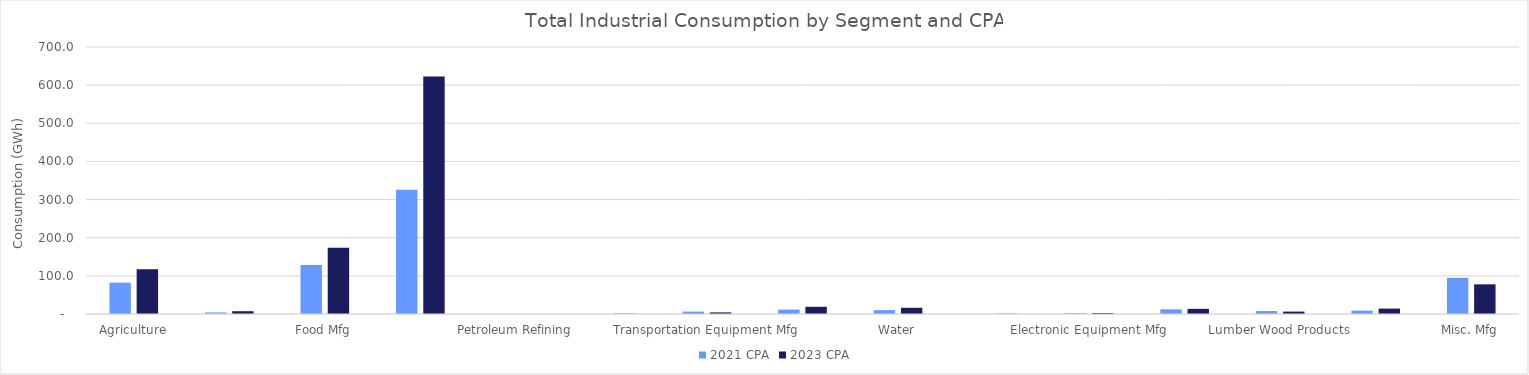
| Category | 2021 CPA | 2023 CPA |
|---|---|---|
| Agriculture | 82.108 | 117.022 |
| Mining | 4.086 | 7.345 |
| Food Mfg | 128.166 | 173.956 |
| Paper Mfg | 326.003 | 622.375 |
| Petroleum Refining | 0.117 | 0.06 |
| Stone Clay Glass Products | 0.441 | 0.792 |
| Transportation Equipment Mfg | 6.323 | 4.202 |
| Wastewater | 11.522 | 18.935 |
| Water | 10.188 | 16.289 |
| Chemical Mfg | 0.419 | 0.55 |
| Electronic Equipment Mfg | 2.138 | 2.636 |
| Industrial Machinery | 12.333 | 13.491 |
| Lumber Wood Products | 7.768 | 6.327 |
| Metal Mfg | 8.812 | 14.176 |
| Misc. Mfg | 94.756 | 77.795 |